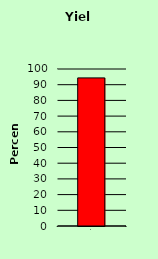
| Category | Series 0 |
|---|---|
| 0 | 94.33 |